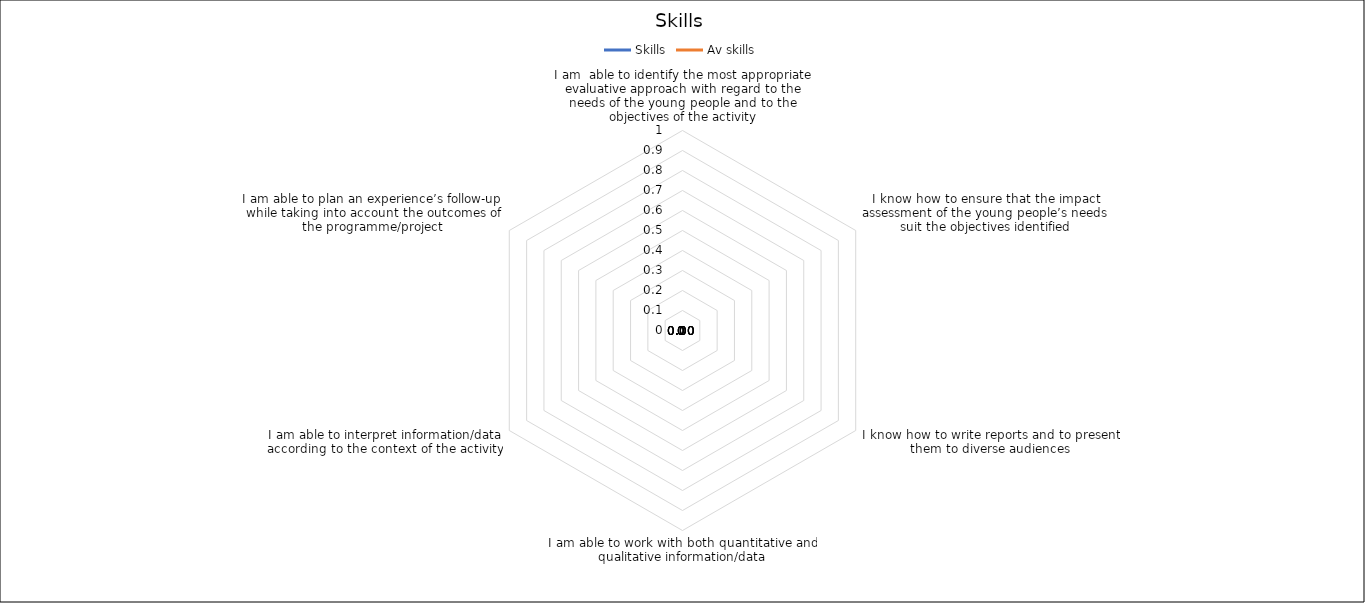
| Category | Skills | Av skills |
|---|---|---|
| I am  able to identify the most appropriate evaluative approach with regard to the needs of the young people and to the objectives of the activity | 0 | 0 |
| I know how to ensure that the impact assessment of the young people’s needs suit the objectives identified | 0 | 0 |
| I know how to write reports and to present them to diverse audiences | 0 | 0 |
| I am able to work with both quantitative and qualitative information/data | 0 | 0 |
| I am able to interpret information/data according to the context of the activity | 0 | 0 |
| I am able to plan an experience’s follow-up while taking into account the outcomes of the programme/project | 0 | 0 |